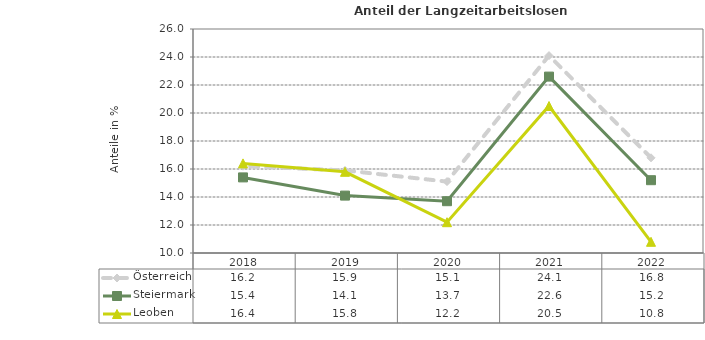
| Category | Österreich | Steiermark | Leoben |
|---|---|---|---|
| 2022.0 | 16.8 | 15.2 | 10.8 |
| 2021.0 | 24.1 | 22.6 | 20.5 |
| 2020.0 | 15.1 | 13.7 | 12.2 |
| 2019.0 | 15.9 | 14.1 | 15.8 |
| 2018.0 | 16.2 | 15.4 | 16.4 |